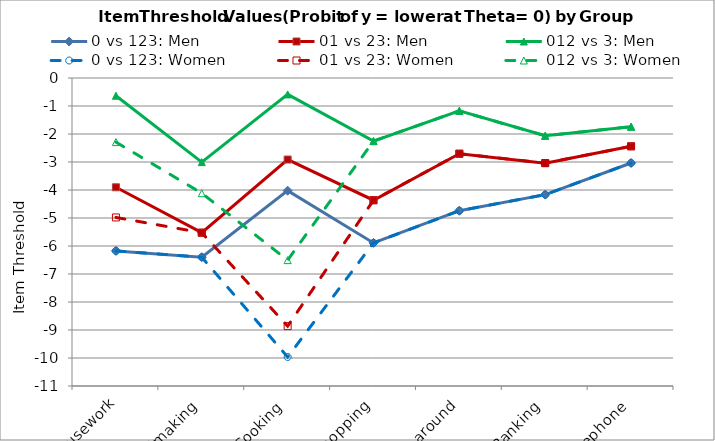
| Category | 0 vs 123: Men | 01 vs 23: Men | 012 vs 3: Men | 0 vs 123: Women | 01 vs 23: Women | 012 vs 3: Women |
|---|---|---|---|---|---|---|
| 1. Housework | -6.175 | -3.903 | -0.633 | -6.175 | -4.98 | -2.289 |
| 2. Bedmaking | -6.4 | -5.524 | -3.005 | -6.4 | -5.524 | -4.115 |
| 3. Cooking | -4.024 | -2.912 | -0.586 | -9.964 | -8.862 | -6.504 |
| 4. Shopping | -5.89 | -4.365 | -2.253 | -5.89 | -4.365 | -2.253 |
| 5. Getting around | -4.74 | -2.704 | -1.174 | -4.74 | -2.704 | -1.174 |
| 6. Banking | -4.165 | -3.04 | -2.063 | -4.165 | -3.04 | -2.063 |
| 7. Telephone | -3.035 | -2.44 | -1.739 | -3.035 | -2.44 | -1.739 |